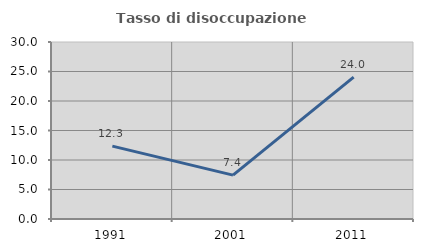
| Category | Tasso di disoccupazione giovanile  |
|---|---|
| 1991.0 | 12.347 |
| 2001.0 | 7.441 |
| 2011.0 | 24.038 |